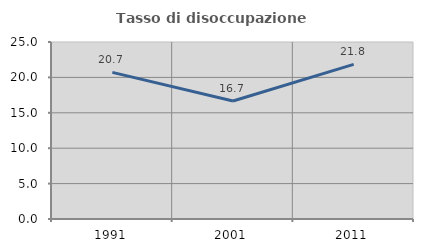
| Category | Tasso di disoccupazione giovanile  |
|---|---|
| 1991.0 | 20.71 |
| 2001.0 | 16.667 |
| 2011.0 | 21.839 |